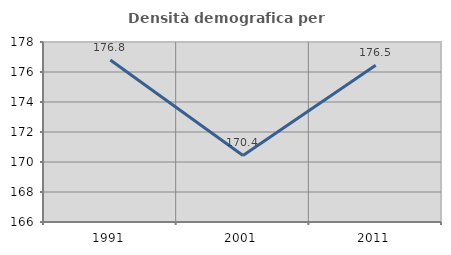
| Category | Densità demografica |
|---|---|
| 1991.0 | 176.795 |
| 2001.0 | 170.438 |
| 2011.0 | 176.456 |